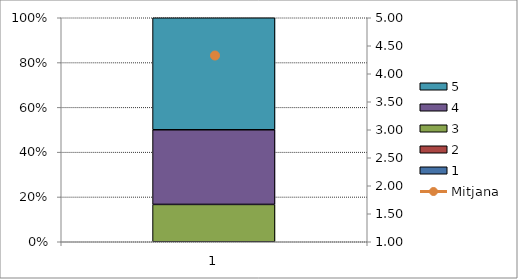
| Category | 1 | 2 | 3 | 4 | 5 |
|---|---|---|---|---|---|
| 0 | 0 | 0 | 2 | 4 | 6 |